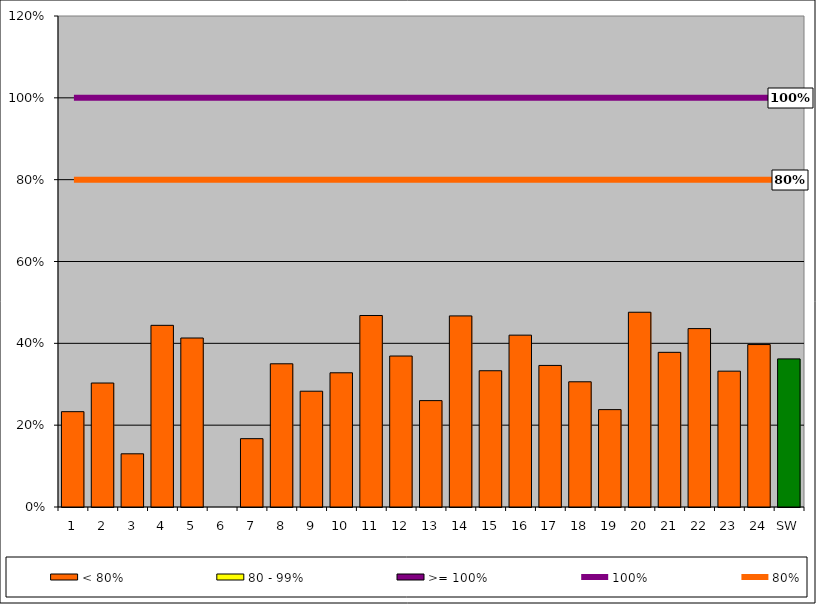
| Category | < 80% | 80 - 99% | >= 100% |
|---|---|---|---|
| 1 | 0.233 | 0 | 0 |
| 2 | 0.303 | 0 | 0 |
| 3 | 0.13 | 0 | 0 |
| 4 | 0.444 | 0 | 0 |
| 5 | 0.413 | 0 | 0 |
| 6 | 0 | 0 | 0 |
| 7 | 0.167 | 0 | 0 |
| 8 | 0.35 | 0 | 0 |
| 9 | 0.283 | 0 | 0 |
| 10 | 0.328 | 0 | 0 |
| 11 | 0.468 | 0 | 0 |
| 12 | 0.369 | 0 | 0 |
| 13 | 0.26 | 0 | 0 |
| 14 | 0.467 | 0 | 0 |
| 15 | 0.333 | 0 | 0 |
| 16 | 0.42 | 0 | 0 |
| 17 | 0.346 | 0 | 0 |
| 18 | 0.306 | 0 | 0 |
| 19 | 0.238 | 0 | 0 |
| 20 | 0.476 | 0 | 0 |
| 21 | 0.378 | 0 | 0 |
| 22 | 0.436 | 0 | 0 |
| 23 | 0.332 | 0 | 0 |
| 24 | 0.397 | 0 | 0 |
| SW | 0.362 | 0 | 0 |